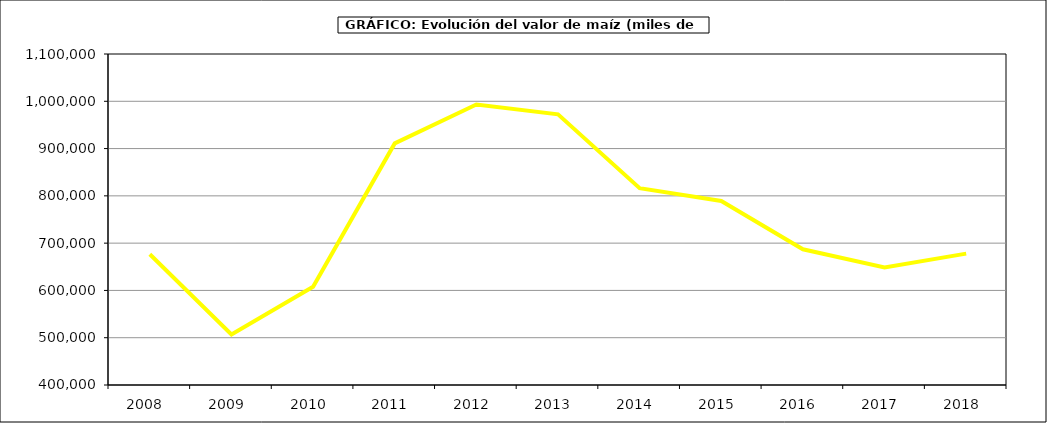
| Category | Valor |
|---|---|
| 2008.0 | 676616.122 |
| 2009.0 | 506951.971 |
| 2010.0 | 607777.279 |
| 2011.0 | 910964.166 |
| 2012.0 | 993073.028 |
| 2013.0 | 972315.092 |
| 2014.0 | 816366 |
| 2015.0 | 789188 |
| 2016.0 | 686933 |
| 2017.0 | 648655.811 |
| 2018.0 | 677820.352 |